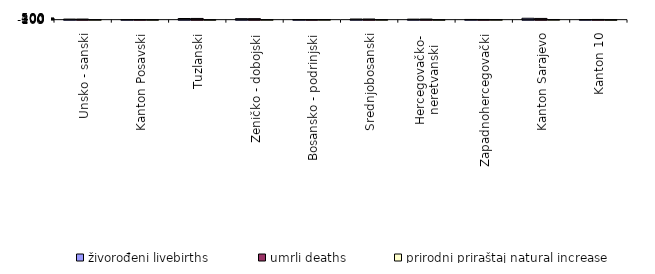
| Category | živorođeni livebirths | umrli deaths | prirodni priraštaj natural increase |
|---|---|---|---|
| Unsko - sanski | 172 | 178 | -6 |
| Kanton Posavski | 19 | 38 | -19 |
| Tuzlanski | 349 | 367 | -18 |
| Zeničko - dobojski | 307 | 306 | 1 |
| Bosansko - podrinjski | 29 | 16 | 13 |
| Srednjobosanski | 195 | 199 | -4 |
| Hercegovačko-
neretvanski | 156 | 180 | -24 |
| Zapadnohercegovački | 61 | 58 | 3 |
| Kanton Sarajevo | 424 | 371 | 53 |
| Kanton 10 | 26 | 61 | -35 |